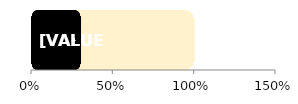
| Category | Total | Women |
|---|---|---|
| 0 | 1 | 0.301 |